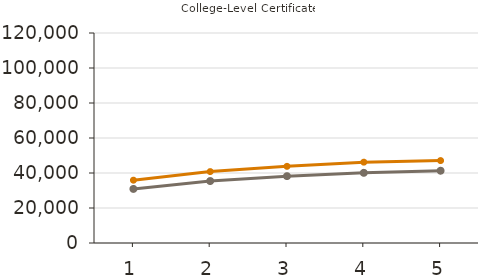
| Category | Mean | Median |
|---|---|---|
| 1.0 | 35900 | 30900 |
| 2.0 | 40800 | 35400 |
| 3.0 | 43800 | 38200 |
| 4.0 | 46200 | 40100 |
| 5.0 | 47100 | 41300 |